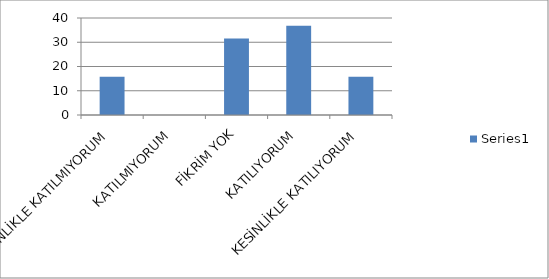
| Category | Series 0 |
|---|---|
| KESİNLİKLE KATILMIYORUM | 15.79 |
| KATILMIYORUM | 0 |
| FİKRİM YOK | 31.58 |
| KATILIYORUM | 36.84 |
| KESİNLİKLE KATILIYORUM | 15.79 |